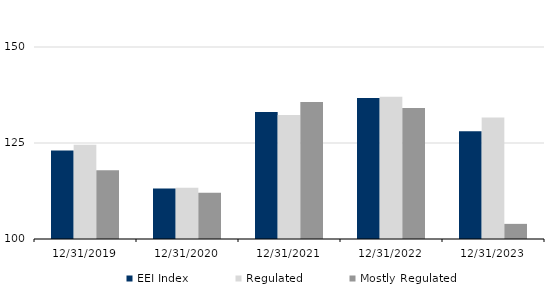
| Category | EEI Index | Regulated | Mostly Regulated |
|---|---|---|---|
| 12/31/19 | 123.056 | 124.562 | 117.872 |
| 12/31/20 | 113.12 | 113.334 | 112.042 |
| 12/31/21 | 133.048 | 132.285 | 135.673 |
| 12/31/22 | 136.694 | 137.034 | 134.118 |
| 12/31/23 | 128.082 | 131.666 | 103.94 |